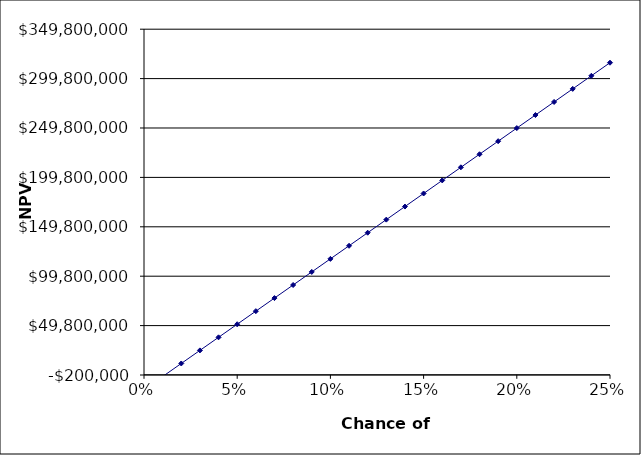
| Category | NPV |
|---|---|
| 0.01 | -1764963.22 |
| 0.02 | 11470073.57 |
| 0.03 | 24705110.35 |
| 0.04 | 37940147.14 |
| 0.05 | 51175183.92 |
| 0.06 | 64410220.7 |
| 0.07 | 77645257.49 |
| 0.08 | 90880294.27 |
| 0.09 | 104115331.06 |
| 0.1 | 117350367.84 |
| 0.11 | 130585404.62 |
| 0.12 | 143820441.41 |
| 0.13 | 157055478.19 |
| 0.14 | 170290514.98 |
| 0.15 | 183525551.76 |
| 0.16 | 196760588.54 |
| 0.17 | 209995625.33 |
| 0.18 | 223230662.11 |
| 0.19 | 236465698.89 |
| 0.2 | 249700735.68 |
| 0.21 | 262935772.46 |
| 0.22 | 276170809.25 |
| 0.23 | 289405846.03 |
| 0.24 | 302640882.81 |
| 0.25 | 315875919.6 |